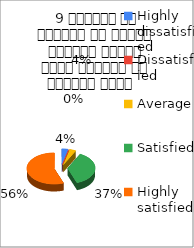
| Category |  9 शिक्षक ने शिक्षण के दौरान आधुनिक तकनीक पावर पॉइन्ट का प्रयोग किया   |
|---|---|
| Highly dissatisfied | 2 |
| Dissatisfied | 0 |
| Average | 2 |
| Satisfied | 20 |
| Highly satisfied | 30 |